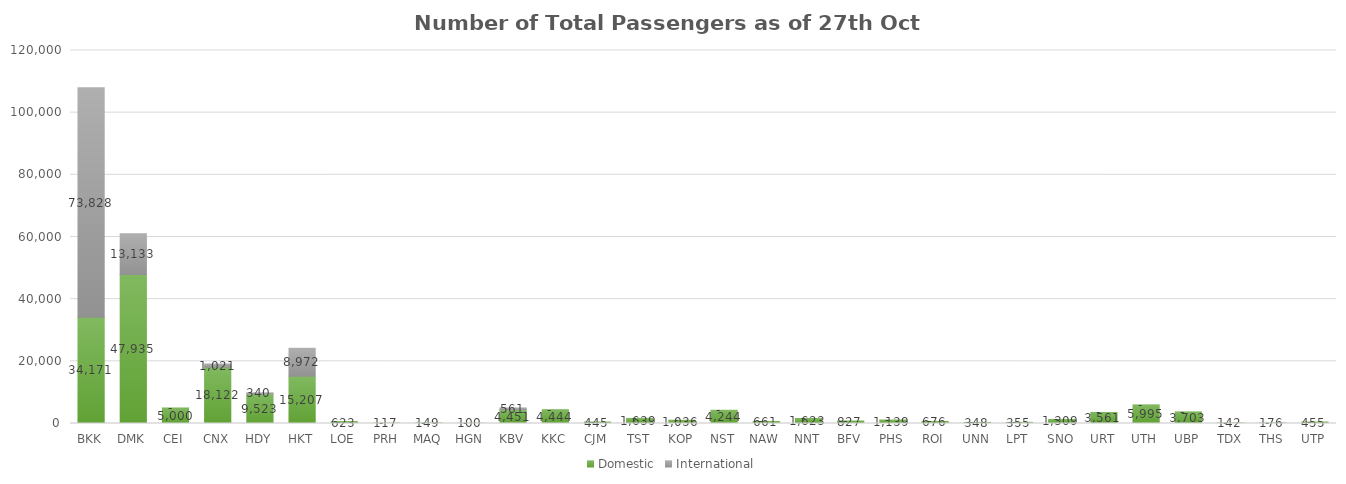
| Category | Domestic | International |
|---|---|---|
| BKK | 34171 | 73828 |
| DMK | 47935 | 13133 |
| CEI | 5000 | 0 |
| CNX | 18122 | 1021 |
| HDY | 9523 | 340 |
| HKT | 15207 | 8972 |
| LOE | 623 | 0 |
| PRH | 117 | 0 |
| MAQ | 149 | 0 |
| HGN | 100 | 0 |
| KBV | 4451 | 561 |
| KKC | 4444 | 0 |
| CJM | 445 | 0 |
| TST | 1639 | 0 |
| KOP | 1036 | 0 |
| NST | 4244 | 0 |
| NAW | 661 | 0 |
| NNT | 1623 | 0 |
| BFV | 827 | 0 |
| PHS | 1139 | 0 |
| ROI | 676 | 0 |
| UNN | 348 | 0 |
| LPT | 355 | 0 |
| SNO | 1309 | 0 |
| URT | 3561 | 0 |
| UTH | 5995 | 0 |
| UBP | 3703 | 0 |
| TDX | 142 | 0 |
| THS | 176 | 0 |
| UTP | 455 | 0 |